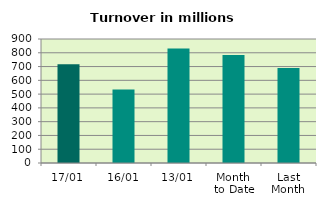
| Category | Series 0 |
|---|---|
| 17/01 | 715.986 |
| 16/01 | 533.607 |
| 13/01 | 830.584 |
| Month 
to Date | 784.726 |
| Last
Month | 689.27 |